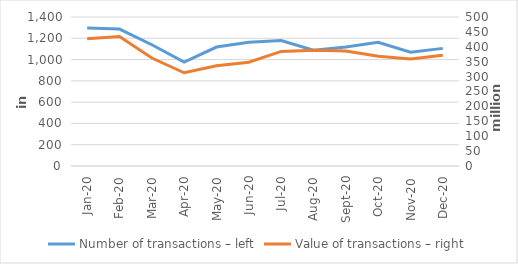
| Category | Number of transactions – left |
|---|---|
| 2020-01-01 | 1296548 |
| 2020-02-01 | 1286499 |
| 2020-03-01 | 1139062 |
| 2020-04-01 | 977144 |
| 2020-05-01 | 1117472 |
| 2020-06-01 | 1163022 |
| 2020-07-01 | 1179033 |
| 2020-08-01 | 1087611 |
| 2020-09-01 | 1117498 |
| 2020-10-01 | 1162177 |
| 2020-11-01 | 1068339 |
| 2020-12-01 | 1105250 |